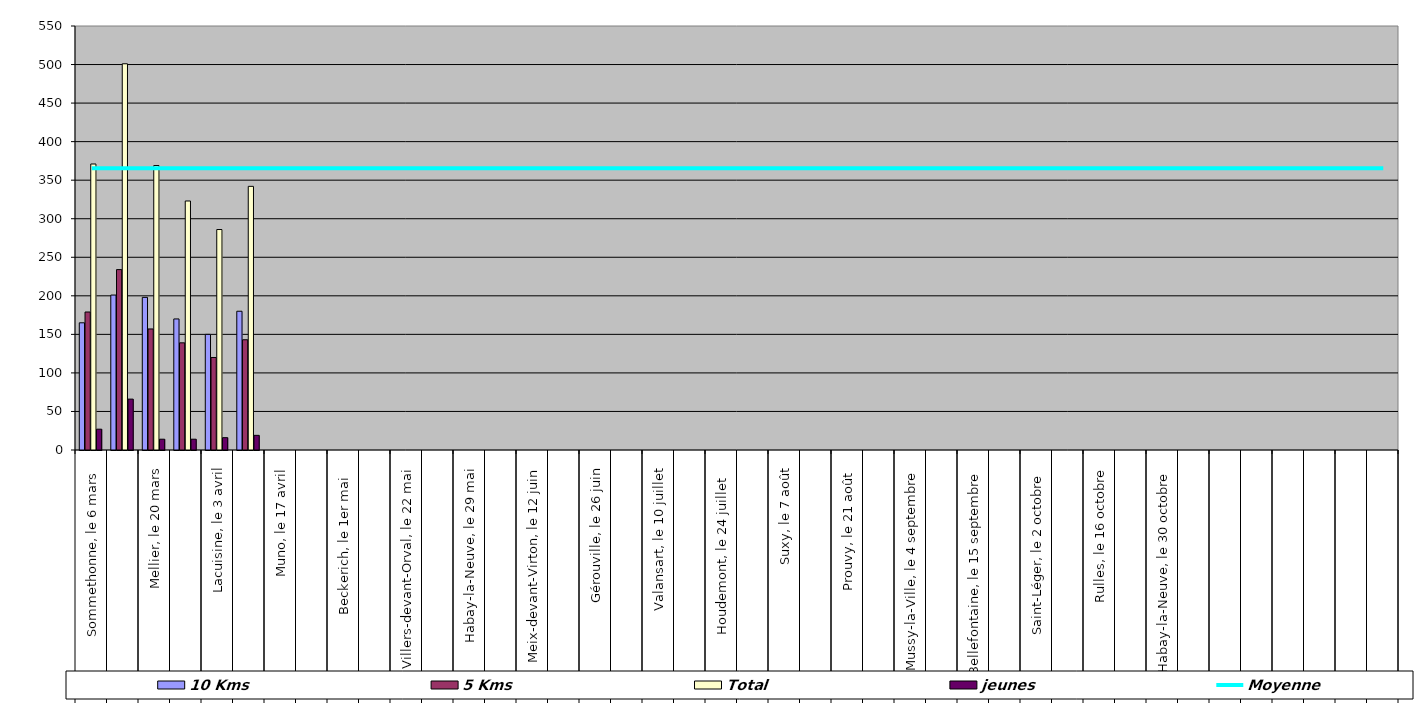
| Category | 10 Kms | 5 Kms | Total | jeunes |
|---|---|---|---|---|
| 0 | 165 | 179 | 371 | 27 |
| 1 | 201 | 234 | 501 | 66 |
| 2 | 198 | 157 | 369 | 14 |
| 3 | 170 | 139 | 323 | 14 |
| 4 | 150 | 120 | 286 | 16 |
| 5 | 180 | 143 | 342 | 19 |
| 6 | 0 | 0 | 0 | 0 |
| 7 | 0 | 0 | 0 | 0 |
| 8 | 0 | 0 | 0 | 0 |
| 9 | 0 | 0 | 0 | 0 |
| 10 | 0 | 0 | 0 | 0 |
| 11 | 0 | 0 | 0 | 0 |
| 12 | 0 | 0 | 0 | 0 |
| 13 | 0 | 0 | 0 | 0 |
| 14 | 0 | 0 | 0 | 0 |
| 15 | 0 | 0 | 0 | 0 |
| 16 | 0 | 0 | 0 | 0 |
| 17 | 0 | 0 | 0 | 0 |
| 18 | 0 | 0 | 0 | 0 |
| 19 | 0 | 0 | 0 | 0 |
| 20 | 0 | 0 | 0 | 0 |
| 21 | 0 | 0 | 0 | 0 |
| 22 | 0 | 0 | 0 | 0 |
| 23 | 0 | 0 | 0 | 0 |
| 24 | 0 | 0 | 0 | 0 |
| 25 | 0 | 0 | 0 | 0 |
| 26 | 0 | 0 | 0 | 0 |
| 27 | 0 | 0 | 0 | 0 |
| 28 | 0 | 0 | 0 | 0 |
| 29 | 0 | 0 | 0 | 0 |
| 30 | 0 | 0 | 0 | 0 |
| 31 | 0 | 0 | 0 | 0 |
| 32 | 0 | 0 | 0 | 0 |
| 33 | 0 | 0 | 0 | 0 |
| 34 | 0 | 0 | 0 | 0 |
| 35 | 0 | 0 | 0 | 0 |
| 36 | 0 | 0 | 0 | 0 |
| 37 | 0 | 0 | 0 | 0 |
| 38 | 0 | 0 | 0 | 0 |
| 39 | 0 | 0 | 0 | 0 |
| 40 | 0 | 0 | 0 | 0 |
| 41 | 0 | 0 | 0 | 0 |